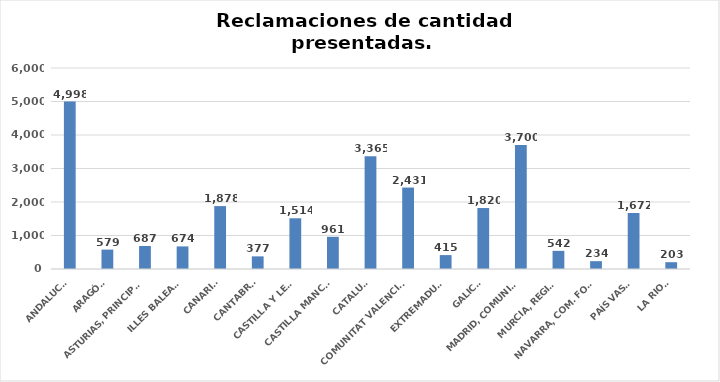
| Category | Series 0 |
|---|---|
| ANDALUCÍA | 4998 |
| ARAGÓN | 579 |
| ASTURIAS, PRINCIPADO | 687 |
| ILLES BALEARS | 674 |
| CANARIAS | 1878 |
| CANTABRIA | 377 |
| CASTILLA Y LEÓN | 1514 |
| CASTILLA MANCHA | 961 |
| CATALUÑA | 3365 |
| COMUNITAT VALENCIANA | 2431 |
| EXTREMADURA | 415 |
| GALICIA | 1820 |
| MADRID, COMUNIDAD | 3700 |
| MURCIA, REGIÓN | 542 |
| NAVARRA, COM. FORAL | 234 |
| PAÍS VASCO | 1672 |
| LA RIOJA | 203 |